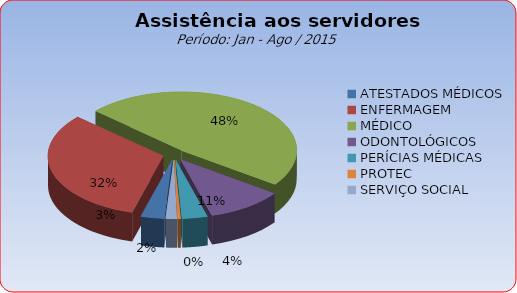
| Category | Series 0 |
|---|---|
| ATESTADOS MÉDICOS | 3.247 |
| ENFERMAGEM | 32.32 |
| MÉDICO | 48.235 |
| ODONTOLÓGICOS | 10.704 |
| PERÍCIAS MÉDICAS | 3.53 |
| PROTEC | 0.434 |
| SERVIÇO SOCIAL | 1.529 |